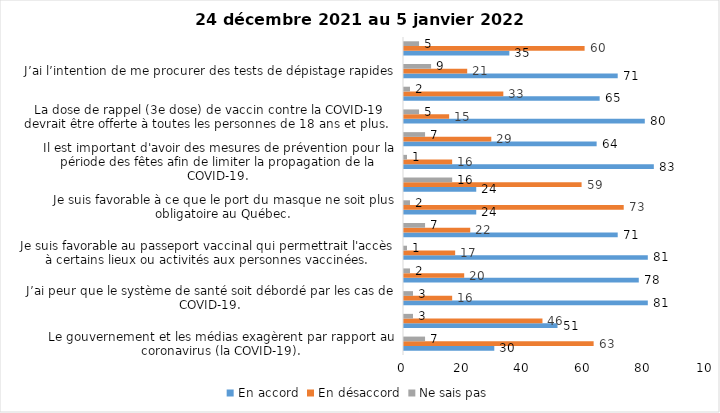
| Category | En accord | En désaccord | Ne sais pas |
|---|---|---|---|
| Le gouvernement et les médias exagèrent par rapport au coronavirus (la COVID-19). | 30 | 63 | 7 |
| Je suis favorable à la mise en place d’un couvre-feu. | 51 | 46 | 3 |
| J’ai peur que le système de santé soit débordé par les cas de COVID-19. | 81 | 16 | 3 |
| Je suis inquiet/inquiète que le nombre de cas augmente en raison des nouveaux variants du virus de la COVID-19. | 78 | 20 | 2 |
| Je suis favorable au passeport vaccinal qui permettrait l'accès à certains lieux ou activités aux personnes vaccinées. | 81 | 17 | 1 |
| Je suis confiant que la vaccination protège efficacement contre les variants de la COVID-19 | 71 | 22 | 7 |
| Je suis favorable à ce que le port du masque ne soit plus obligatoire au Québec. | 24 | 73 | 2 |
| La vaccination des enfants entre 5 et 11 ans mettra fin à la pandémie. | 24 | 59 | 16 |
| Il est important d'avoir des mesures de prévention pour la période des fêtes afin de limiter la propagation de la COVID-19. | 83 | 16 | 1 |
| La pandémie ne sera pas terminée au Québec avant que tous les habitants de la terre puissent être vaccinés contre la COVID-19.   | 64 | 29 | 7 |
| La dose de rappel (3e dose) de vaccin contre la COVID-19 devrait être offerte à toutes les personnes de 18 ans et plus.  | 80 | 15 | 5 |
| Je suis inconfortable d’être en contact avec une personne non vaccinée contre la COVID-19 | 65 | 33 | 2 |
| J’ai l’intention de me procurer des tests de dépistage rapides | 71 | 21 | 9 |
| Je n'ai pas peur du variant Omicron, car il semble moins dangereux pour la santé. | 35 | 60 | 5 |